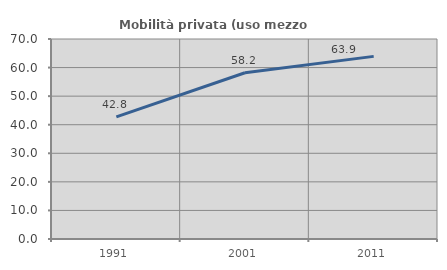
| Category | Mobilità privata (uso mezzo privato) |
|---|---|
| 1991.0 | 42.752 |
| 2001.0 | 58.184 |
| 2011.0 | 63.921 |